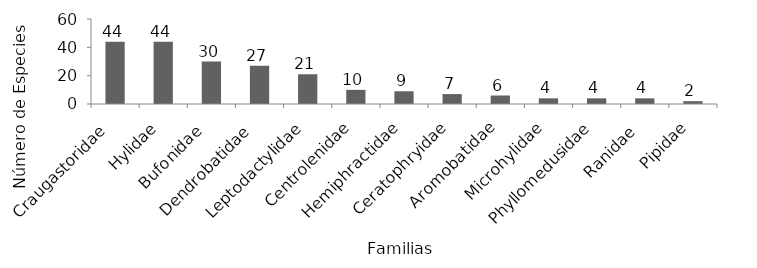
| Category | No. Especie |
|---|---|
| Craugastoridae  | 44 |
| Hylidae | 44 |
| Bufonidae  | 30 |
| Dendrobatidae  | 27 |
| Leptodactylidae | 21 |
| Centrolenidae | 10 |
| Hemiphractidae | 9 |
| Ceratophryidae | 7 |
| Aromobatidae | 6 |
| Microhylidae | 4 |
| Phyllomedusidae | 4 |
| Ranidae  | 4 |
| Pipidae | 2 |